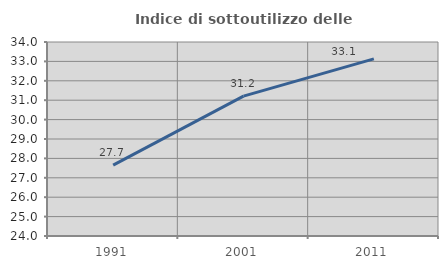
| Category | Indice di sottoutilizzo delle abitazioni  |
|---|---|
| 1991.0 | 27.654 |
| 2001.0 | 31.21 |
| 2011.0 | 33.13 |